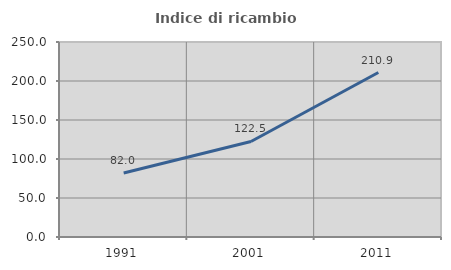
| Category | Indice di ricambio occupazionale  |
|---|---|
| 1991.0 | 82.018 |
| 2001.0 | 122.465 |
| 2011.0 | 210.865 |